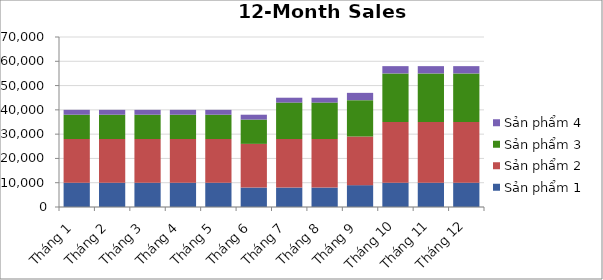
| Category | Sản phẩm 1 | Sản phẩm 2 | Sản phẩm 3 | Sản phẩm 4 |
|---|---|---|---|---|
| Tháng 1 | 10000 | 18000 | 10000 | 2000 |
| Tháng 2 | 10000 | 18000 | 10000 | 2000 |
| Tháng 3 | 10000 | 18000 | 10000 | 2000 |
| Tháng 4 | 10000 | 18000 | 10000 | 2000 |
| Tháng 5 | 10000 | 18000 | 10000 | 2000 |
| Tháng 6 | 8000 | 18000 | 10000 | 2000 |
| Tháng 7 | 8000 | 20000 | 15000 | 2000 |
| Tháng 8 | 8000 | 20000 | 15000 | 2000 |
| Tháng 9 | 9000 | 20000 | 15000 | 3000 |
| Tháng 10 | 10000 | 25000 | 20000 | 3000 |
| Tháng 11 | 10000 | 25000 | 20000 | 3000 |
| Tháng 12 | 10000 | 25000 | 20000 | 3000 |